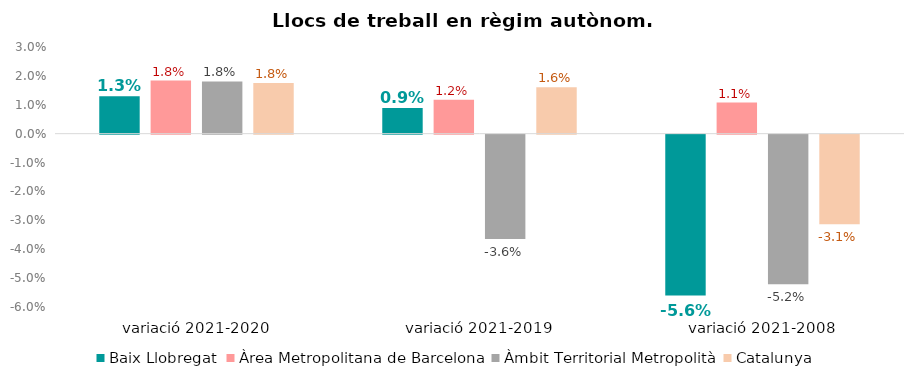
| Category | Baix Llobregat | Àrea Metropolitana de Barcelona | Àmbit Territorial Metropolità | Catalunya |
|---|---|---|---|---|
| variació 2021-2020 | 0.013 | 0.018 | 0.018 | 0.018 |
| variació 2021-2019 | 0.009 | 0.012 | -0.036 | 0.016 |
| variació 2021-2008 | -0.056 | 0.011 | -0.052 | -0.031 |